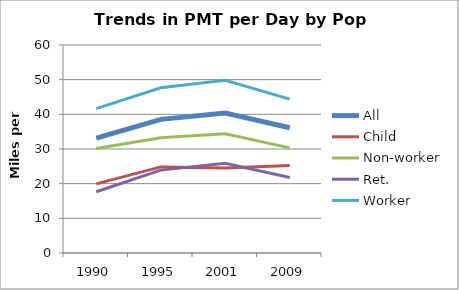
| Category | All | Child | Non-worker | Ret. | Worker |
|---|---|---|---|---|---|
| 1990.0 | 33.14 | 19.93 | 30.15 | 17.66 | 41.63 |
| 1995.0 | 38.55 | 24.83 | 33.27 | 23.91 | 47.68 |
| 2001.0 | 40.39 | 24.52 | 34.42 | 25.91 | 49.8 |
| 2009.0 | 36.13 | 25.26 | 30.33 | 21.8 | 44.4 |